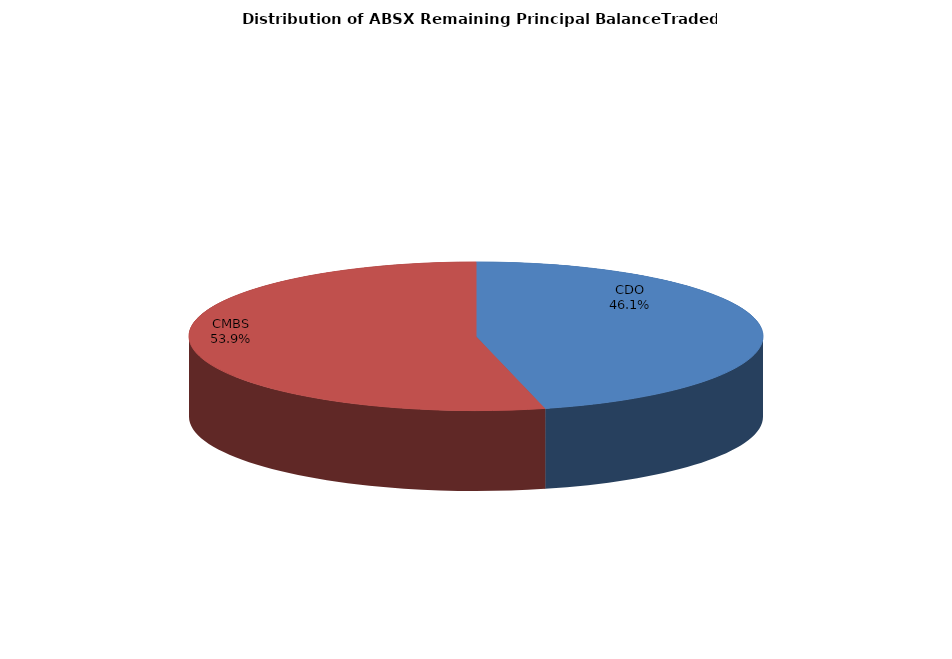
| Category | Series 0 |
|---|---|
| CDO | 1116959348.963 |
| CMBS | 1304548870.976 |